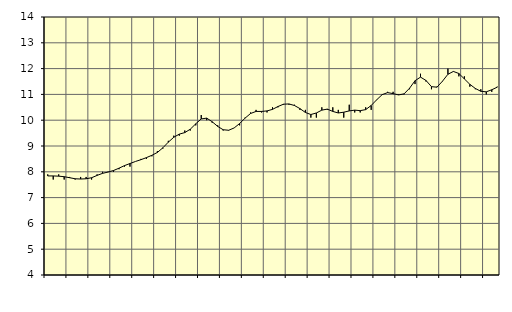
| Category | Piggar | Byggverksamhet, SNI 41-431 |
|---|---|---|
| nan | 7.9 | 7.84 |
| 1.0 | 7.7 | 7.84 |
| 1.0 | 7.9 | 7.83 |
| 1.0 | 7.7 | 7.81 |
| nan | 7.8 | 7.77 |
| 2.0 | 7.7 | 7.73 |
| 2.0 | 7.8 | 7.72 |
| 2.0 | 7.8 | 7.73 |
| nan | 7.7 | 7.77 |
| 3.0 | 7.9 | 7.86 |
| 3.0 | 8 | 7.94 |
| 3.0 | 8 | 7.99 |
| nan | 8 | 8.05 |
| 4.0 | 8.1 | 8.14 |
| 4.0 | 8.2 | 8.24 |
| 4.0 | 8.2 | 8.32 |
| nan | 8.4 | 8.4 |
| 5.0 | 8.5 | 8.47 |
| 5.0 | 8.5 | 8.55 |
| 5.0 | 8.6 | 8.64 |
| nan | 8.8 | 8.75 |
| 6.0 | 8.9 | 8.93 |
| 6.0 | 9.2 | 9.15 |
| 6.0 | 9.4 | 9.34 |
| nan | 9.4 | 9.46 |
| 7.0 | 9.6 | 9.52 |
| 7.0 | 9.6 | 9.65 |
| 7.0 | 9.8 | 9.86 |
| nan | 10.2 | 10.05 |
| 8.0 | 10 | 10.08 |
| 8.0 | 9.9 | 9.94 |
| 8.0 | 9.8 | 9.76 |
| nan | 9.6 | 9.63 |
| 9.0 | 9.6 | 9.61 |
| 9.0 | 9.7 | 9.7 |
| 9.0 | 9.8 | 9.87 |
| nan | 10.1 | 10.08 |
| 10.0 | 10.3 | 10.26 |
| 10.0 | 10.4 | 10.34 |
| 10.0 | 10.3 | 10.34 |
| nan | 10.3 | 10.36 |
| 11.0 | 10.5 | 10.42 |
| 11.0 | 10.5 | 10.53 |
| 11.0 | 10.6 | 10.62 |
| nan | 10.6 | 10.63 |
| 12.0 | 10.6 | 10.57 |
| 12.0 | 10.4 | 10.45 |
| 12.0 | 10.4 | 10.3 |
| nan | 10.1 | 10.22 |
| 13.0 | 10.1 | 10.28 |
| 13.0 | 10.5 | 10.39 |
| 13.0 | 10.4 | 10.43 |
| nan | 10.5 | 10.34 |
| 14.0 | 10.4 | 10.28 |
| 14.0 | 10.1 | 10.31 |
| 14.0 | 10.6 | 10.36 |
| nan | 10.3 | 10.39 |
| 15.0 | 10.3 | 10.37 |
| 15.0 | 10.5 | 10.41 |
| 15.0 | 10.4 | 10.57 |
| nan | 10.8 | 10.79 |
| 16.0 | 11 | 10.99 |
| 16.0 | 11.1 | 11.07 |
| 16.0 | 11.1 | 11.03 |
| nan | 11 | 10.98 |
| 17.0 | 11 | 11.02 |
| 17.0 | 11.2 | 11.24 |
| 17.0 | 11.4 | 11.53 |
| nan | 11.8 | 11.67 |
| 18.0 | 11.5 | 11.54 |
| 18.0 | 11.2 | 11.3 |
| 18.0 | 11.3 | 11.28 |
| nan | 11.5 | 11.51 |
| 19.0 | 12 | 11.78 |
| 19.0 | 11.9 | 11.89 |
| 19.0 | 11.7 | 11.81 |
| nan | 11.7 | 11.6 |
| 20.0 | 11.3 | 11.39 |
| 20.0 | 11.2 | 11.23 |
| 20.0 | 11.2 | 11.12 |
| nan | 11 | 11.1 |
| 21.0 | 11.1 | 11.18 |
| 21.0 | 11.3 | 11.28 |